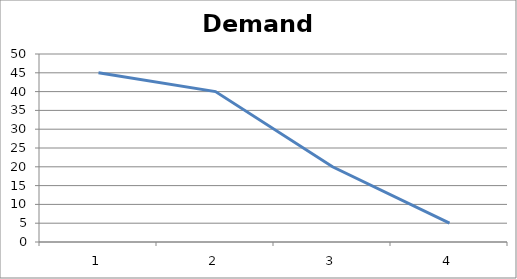
| Category | P |
|---|---|
| 0 | 45 |
| 1 | 40 |
| 2 | 20 |
| 3 | 5 |